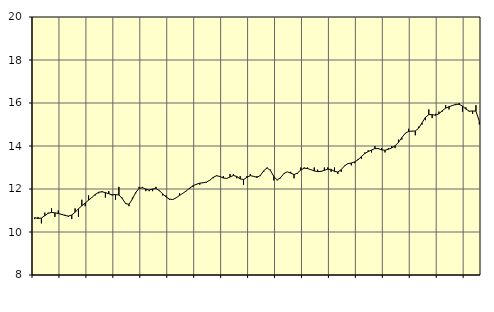
| Category | Piggar | Utbildning, SNI 85 |
|---|---|---|
| nan | 10.6 | 10.67 |
| 87.0 | 10.7 | 10.63 |
| 87.0 | 10.4 | 10.65 |
| 87.0 | 10.9 | 10.76 |
| nan | 10.9 | 10.87 |
| 88.0 | 11.1 | 10.91 |
| 88.0 | 10.7 | 10.89 |
| 88.0 | 11 | 10.86 |
| nan | 10.8 | 10.82 |
| 89.0 | 10.8 | 10.77 |
| 89.0 | 10.7 | 10.74 |
| 89.0 | 10.6 | 10.79 |
| nan | 11.1 | 10.92 |
| 90.0 | 10.7 | 11.08 |
| 90.0 | 11.5 | 11.22 |
| 90.0 | 11.2 | 11.35 |
| nan | 11.7 | 11.48 |
| 91.0 | 11.6 | 11.61 |
| 91.0 | 11.7 | 11.75 |
| 91.0 | 11.8 | 11.85 |
| nan | 11.9 | 11.87 |
| 92.0 | 11.6 | 11.83 |
| 92.0 | 11.9 | 11.78 |
| 92.0 | 11.7 | 11.73 |
| nan | 11.5 | 11.74 |
| 93.0 | 12.1 | 11.72 |
| 93.0 | 11.6 | 11.56 |
| 93.0 | 11.3 | 11.32 |
| nan | 11.2 | 11.29 |
| 94.0 | 11.6 | 11.53 |
| 94.0 | 11.8 | 11.84 |
| 94.0 | 12.1 | 12.03 |
| nan | 12.1 | 12.06 |
| 95.0 | 11.9 | 11.99 |
| 95.0 | 11.9 | 11.95 |
| 95.0 | 11.9 | 12 |
| nan | 12.1 | 12.02 |
| 96.0 | 11.9 | 11.93 |
| 96.0 | 11.7 | 11.77 |
| 96.0 | 11.7 | 11.63 |
| nan | 11.5 | 11.53 |
| 97.0 | 11.5 | 11.51 |
| 97.0 | 11.6 | 11.59 |
| 97.0 | 11.8 | 11.7 |
| nan | 11.8 | 11.8 |
| 98.0 | 11.9 | 11.91 |
| 98.0 | 12 | 12.04 |
| 98.0 | 12.1 | 12.15 |
| nan | 12.2 | 12.22 |
| 99.0 | 12.2 | 12.27 |
| 99.0 | 12.3 | 12.29 |
| 99.0 | 12.3 | 12.32 |
| nan | 12.4 | 12.41 |
| 0.0 | 12.5 | 12.54 |
| 0.0 | 12.6 | 12.62 |
| 0.0 | 12.6 | 12.58 |
| nan | 12.6 | 12.51 |
| 1.0 | 12.5 | 12.49 |
| 1.0 | 12.7 | 12.56 |
| 1.0 | 12.7 | 12.63 |
| nan | 12.5 | 12.58 |
| 2.0 | 12.6 | 12.47 |
| 2.0 | 12.2 | 12.44 |
| 2.0 | 12.6 | 12.54 |
| nan | 12.7 | 12.62 |
| 3.0 | 12.6 | 12.59 |
| 3.0 | 12.6 | 12.54 |
| 3.0 | 12.6 | 12.63 |
| nan | 12.8 | 12.85 |
| 4.0 | 13 | 12.98 |
| 4.0 | 12.9 | 12.86 |
| 4.0 | 12.4 | 12.58 |
| nan | 12.4 | 12.42 |
| 5.0 | 12.5 | 12.53 |
| 5.0 | 12.7 | 12.72 |
| 5.0 | 12.8 | 12.8 |
| nan | 12.8 | 12.74 |
| 6.0 | 12.5 | 12.67 |
| 6.0 | 12.7 | 12.74 |
| 6.0 | 13 | 12.88 |
| nan | 13 | 12.97 |
| 7.0 | 13 | 12.95 |
| 7.0 | 12.9 | 12.9 |
| 7.0 | 13 | 12.84 |
| nan | 12.9 | 12.81 |
| 8.0 | 12.8 | 12.82 |
| 8.0 | 13 | 12.87 |
| 8.0 | 13 | 12.92 |
| nan | 12.8 | 12.91 |
| 9.0 | 13 | 12.82 |
| 9.0 | 12.7 | 12.79 |
| 9.0 | 12.8 | 12.9 |
| nan | 13.1 | 13.08 |
| 10.0 | 13.2 | 13.18 |
| 10.0 | 13.1 | 13.21 |
| 10.0 | 13.2 | 13.26 |
| nan | 13.4 | 13.36 |
| 11.0 | 13.4 | 13.51 |
| 11.0 | 13.7 | 13.65 |
| 11.0 | 13.8 | 13.74 |
| nan | 13.7 | 13.81 |
| 12.0 | 14 | 13.88 |
| 12.0 | 13.9 | 13.88 |
| 12.0 | 13.9 | 13.82 |
| nan | 13.7 | 13.8 |
| 13.0 | 13.9 | 13.85 |
| 13.0 | 14 | 13.91 |
| 13.0 | 13.9 | 14.01 |
| nan | 14.3 | 14.17 |
| 14.0 | 14.3 | 14.39 |
| 14.0 | 14.6 | 14.59 |
| 14.0 | 14.8 | 14.68 |
| nan | 14.7 | 14.69 |
| 15.0 | 14.5 | 14.7 |
| 15.0 | 14.9 | 14.83 |
| 15.0 | 15 | 15.08 |
| nan | 15.2 | 15.33 |
| 16.0 | 15.7 | 15.46 |
| 16.0 | 15.3 | 15.46 |
| 16.0 | 15.5 | 15.43 |
| nan | 15.6 | 15.5 |
| 17.0 | 15.6 | 15.64 |
| 17.0 | 15.9 | 15.76 |
| 17.0 | 15.7 | 15.83 |
| nan | 15.9 | 15.88 |
| 18.0 | 15.9 | 15.94 |
| 18.0 | 16 | 15.94 |
| 18.0 | 15.6 | 15.86 |
| nan | 15.8 | 15.72 |
| 19.0 | 15.6 | 15.62 |
| 19.0 | 15.5 | 15.63 |
| 19.0 | 15.9 | 15.62 |
| nan | 15 | 15.15 |